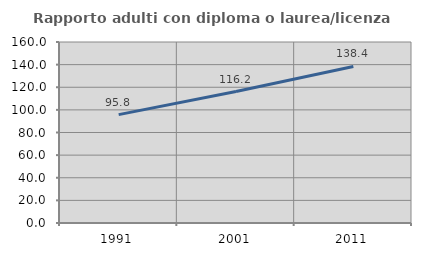
| Category | Rapporto adulti con diploma o laurea/licenza media  |
|---|---|
| 1991.0 | 95.816 |
| 2001.0 | 116.17 |
| 2011.0 | 138.386 |